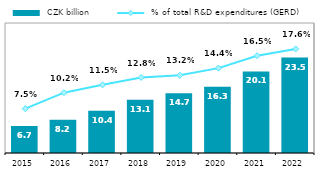
| Category |  CZK billion |
|---|---|
| 2015.0 | 6.651 |
| 2016.0 | 8.182 |
| 2017.0 | 10.424 |
| 2018.0 | 13.125 |
| 2019.0 | 14.683 |
| 2020.0 | 16.284 |
| 2021.0 | 20.078 |
| 2022.0 | 23.479 |